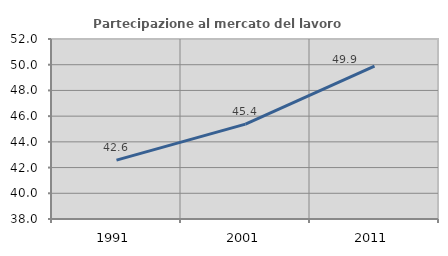
| Category | Partecipazione al mercato del lavoro  femminile |
|---|---|
| 1991.0 | 42.582 |
| 2001.0 | 45.382 |
| 2011.0 | 49.891 |